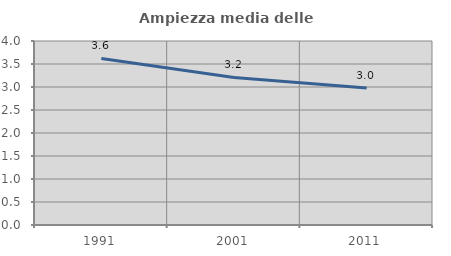
| Category | Ampiezza media delle famiglie |
|---|---|
| 1991.0 | 3.62 |
| 2001.0 | 3.208 |
| 2011.0 | 2.98 |